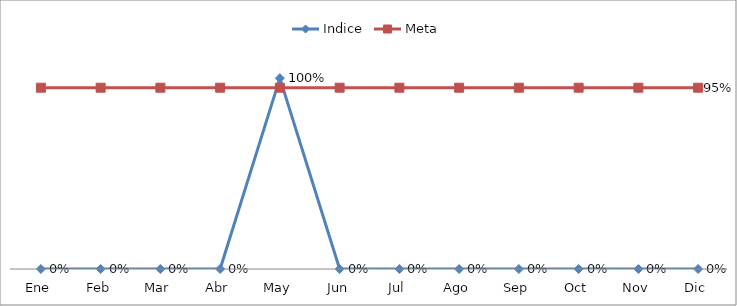
| Category | Indice | Meta |
|---|---|---|
| Ene | 0 | 0.95 |
| Feb | 0 | 0.95 |
| Mar | 0 | 0.95 |
| Abr | 0 | 0.95 |
| May | 1 | 0.95 |
| Jun | 0 | 0.95 |
| Jul | 0 | 0.95 |
| Ago | 0 | 0.95 |
| Sep | 0 | 0.95 |
| Oct | 0 | 0.95 |
| Nov | 0 | 0.95 |
| Dic | 0 | 0.95 |